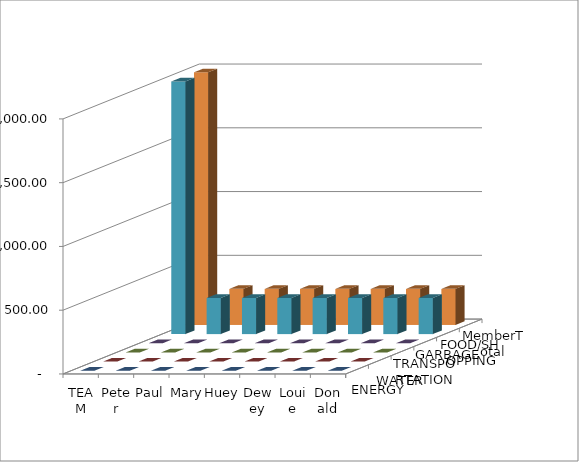
| Category | ENERGY | WATER | TRANSPORTATION | GARBAGE | FOOD/SHOPPING | MemberTotal |
|---|---|---|---|---|---|---|
| TEAM TOTAL | 0 | 0 | 0 | 0 | 1981.125 | 1981.125 |
| Peter | 0 | 0 | 0 | 0 | 283.018 | 283.018 |
| Paul | 0 | 0 | 0 | 0 | 283.018 | 283.018 |
| Mary | 0 | 0 | 0 | 0 | 283.018 | 283.018 |
| Huey | 0 | 0 | 0 | 0 | 283.018 | 283.018 |
| Dewey | 0 | 0 | 0 | 0 | 283.018 | 283.018 |
| Louie | 0 | 0 | 0 | 0 | 283.018 | 283.018 |
| Donald | 0 | 0 | 0 | 0 | 283.018 | 283.018 |